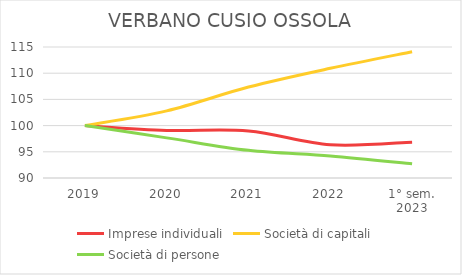
| Category | Imprese individuali | Società di capitali | Società di persone |
|---|---|---|---|
| 2019 | 100 | 100 | 100 |
| 2020 | 99.079 | 102.817 | 97.66 |
| 2021 | 98.959 | 107.359 | 95.274 |
| 2022 | 96.336 | 110.934 | 94.197 |
| 1° sem.
2023 | 96.837 | 114.087 | 92.7 |